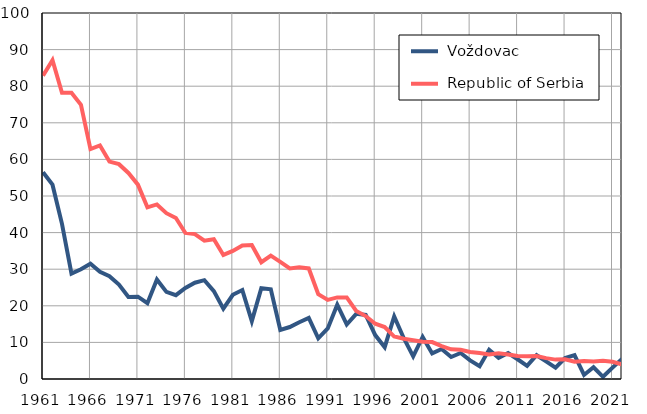
| Category |  Voždovac |  Republic of Serbia |
|---|---|---|
| 1961.0 | 56.5 | 82.9 |
| 1962.0 | 53.1 | 87.1 |
| 1963.0 | 42.4 | 78.2 |
| 1964.0 | 28.8 | 78.2 |
| 1965.0 | 30 | 74.9 |
| 1966.0 | 31.5 | 62.8 |
| 1967.0 | 29.3 | 63.8 |
| 1968.0 | 28.1 | 59.4 |
| 1969.0 | 25.8 | 58.7 |
| 1970.0 | 22.4 | 56.3 |
| 1971.0 | 22.5 | 53.1 |
| 1972.0 | 20.7 | 46.9 |
| 1973.0 | 27.2 | 47.7 |
| 1974.0 | 23.8 | 45.3 |
| 1975.0 | 22.9 | 44 |
| 1976.0 | 24.9 | 39.9 |
| 1977.0 | 26.3 | 39.6 |
| 1978.0 | 27 | 37.8 |
| 1979.0 | 24 | 38.2 |
| 1980.0 | 19.2 | 33.9 |
| 1981.0 | 23 | 35 |
| 1982.0 | 24.3 | 36.5 |
| 1983.0 | 15.8 | 36.6 |
| 1984.0 | 24.8 | 31.9 |
| 1985.0 | 24.5 | 33.7 |
| 1986.0 | 13.4 | 32 |
| 1987.0 | 14.2 | 30.2 |
| 1988.0 | 15.5 | 30.5 |
| 1989.0 | 16.7 | 30.2 |
| 1990.0 | 11.1 | 23.2 |
| 1991.0 | 13.8 | 21.6 |
| 1992.0 | 20.3 | 22.3 |
| 1993.0 | 14.9 | 22.3 |
| 1994.0 | 17.8 | 18.6 |
| 1995.0 | 17.5 | 17.2 |
| 1996.0 | 12 | 15.1 |
| 1997.0 | 8.7 | 14.2 |
| 1998.0 | 17.1 | 11.6 |
| 1999.0 | 11.2 | 11 |
| 2000.0 | 6.2 | 10.6 |
| 2001.0 | 11.5 | 10.2 |
| 2002.0 | 7 | 10.1 |
| 2003.0 | 8.2 | 9 |
| 2004.0 | 6 | 8.1 |
| 2005.0 | 7.1 | 8 |
| 2006.0 | 5.1 | 7.4 |
| 2007.0 | 3.5 | 7.1 |
| 2008.0 | 8 | 6.7 |
| 2009.0 | 5.8 | 7 |
| 2010.0 | 7.1 | 6.7 |
| 2011.0 | 5.4 | 6.3 |
| 2012.0 | 3.6 | 6.2 |
| 2013.0 | 6.5 | 6.3 |
| 2014.0 | 4.8 | 5.7 |
| 2015.0 | 3.1 | 5.3 |
| 2016.0 | 5.7 | 5.4 |
| 2017.0 | 6.5 | 4.7 |
| 2018.0 | 1.1 | 4.9 |
| 2019.0 | 3.2 | 4.8 |
| 2020.0 | 0.6 | 5 |
| 2021.0 | 3.1 | 4.7 |
| 2022.0 | 5.5 | 4 |